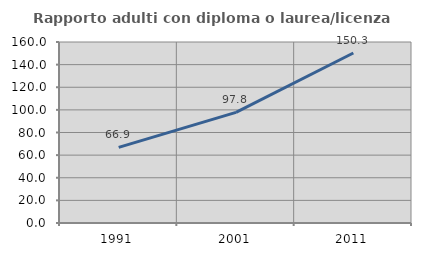
| Category | Rapporto adulti con diploma o laurea/licenza media  |
|---|---|
| 1991.0 | 66.879 |
| 2001.0 | 97.813 |
| 2011.0 | 150.254 |